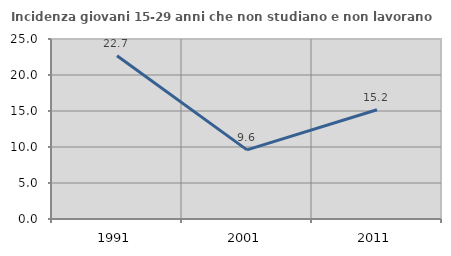
| Category | Incidenza giovani 15-29 anni che non studiano e non lavorano  |
|---|---|
| 1991.0 | 22.679 |
| 2001.0 | 9.597 |
| 2011.0 | 15.171 |